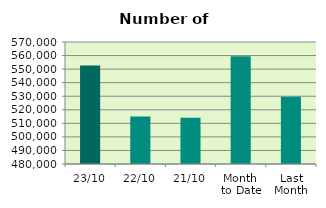
| Category | Series 0 |
|---|---|
| 23/10 | 552718 |
| 22/10 | 514950 |
| 21/10 | 514108 |
| Month 
to Date | 559475.294 |
| Last
Month | 529677.905 |